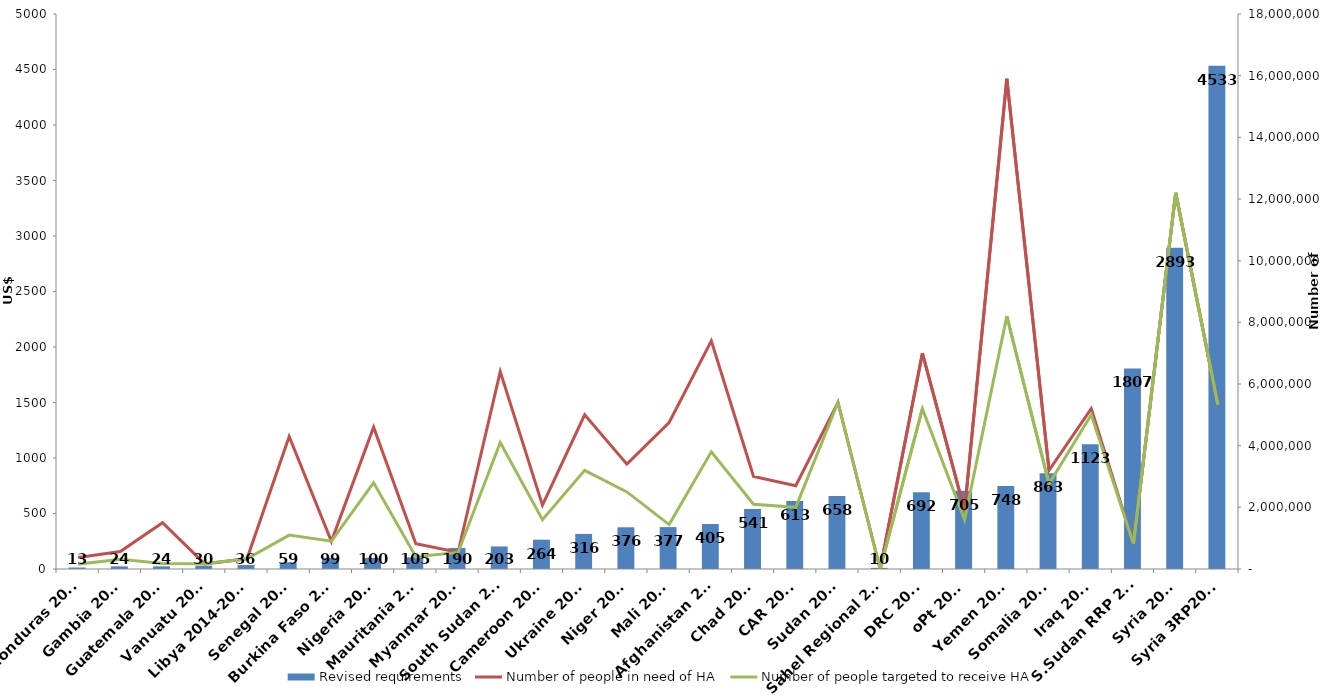
| Category | Revised requirements |
|---|---|
| Honduras 2015 | 13.2 |
| Gambia 2015 | 23.688 |
| Guatemala 2015 | 23.807 |
| Vanuatu 2015 | 29.878 |
| Libya 2014-2015 | 35.739 |
| Senegal 2015 | 59.427 |
| Burkina Faso 2015 | 98.762 |
| Nigeria 2015 | 100.263 |
| Mauritania 2015 | 105.172 |
| Myanmar 2015 | 189.545 |
| South Sudan 2015 | 203.164 |
| Cameroon 2015 | 264.023 |
| Ukraine 2015 | 316 |
| Niger 2015 | 375.72 |
| Mali 2015 | 377.382 |
| Afghanistan 2015 | 405.4 |
| Chad 2015 | 540.882 |
| CAR 2015 | 612.959 |
| Sudan 2015 | 657.794 |
| DRC 2015 | 692 |
| oPt 2015 | 705.289 |
| Yemen 2015 | 747.518 |
| Somalia 2015 | 862.58 |
| Iraq 2015 | 1122.873 |
| S.Sudan RRP 2015 | 1807.069 |
| Syria 2015 | 2893.445 |
| Syria 3RP2015 | 4533.248 |